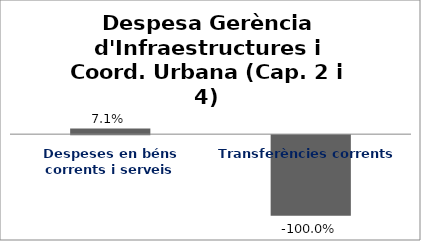
| Category | Series 0 |
|---|---|
| Despeses en béns corrents i serveis | 0.071 |
| Transferències corrents | -1 |